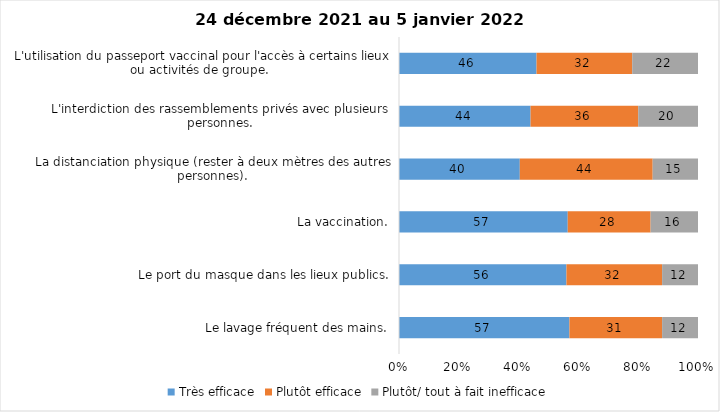
| Category | Très efficace | Plutôt efficace | Plutôt/ tout à fait inefficace |
|---|---|---|---|
| Le lavage fréquent des mains. | 57 | 31 | 12 |
| Le port du masque dans les lieux publics. | 56 | 32 | 12 |
| La vaccination. | 57 | 28 | 16 |
| La distanciation physique (rester à deux mètres des autres personnes). | 40 | 44 | 15 |
| L'interdiction des rassemblements privés avec plusieurs personnes. | 44 | 36 | 20 |
| L'utilisation du passeport vaccinal pour l'accès à certains lieux ou activités de groupe.  | 46 | 32 | 22 |